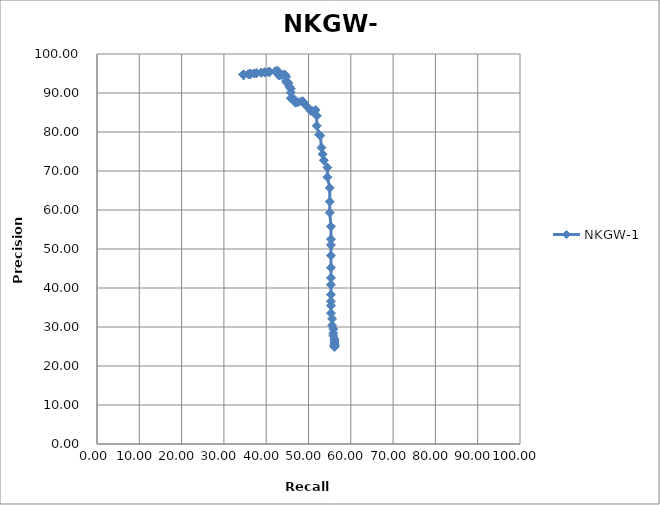
| Category | NKGW-1 |
|---|---|
| 34.637 | 94.656 |
| 34.637 | 94.656 |
| 34.637 | 94.656 |
| 34.637 | 94.656 |
| 34.637 | 94.656 |
| 34.637 | 94.656 |
| 34.637 | 94.656 |
| 34.637 | 94.656 |
| 34.637 | 94.656 |
| 34.637 | 94.656 |
| 34.637 | 94.656 |
| 34.637 | 94.656 |
| 34.637 | 94.656 |
| 35.754 | 94.815 |
| 36.034 | 94.853 |
| 36.313 | 94.891 |
| 36.313 | 94.891 |
| 36.313 | 94.891 |
| 37.151 | 95 |
| 37.151 | 95 |
| 37.151 | 95 |
| 37.709 | 95.07 |
| 37.709 | 95.07 |
| 38.827 | 95.205 |
| 38.827 | 95.205 |
| 39.665 | 95.302 |
| 39.665 | 95.302 |
| 39.665 | 95.302 |
| 40.503 | 95.395 |
| 40.782 | 95.425 |
| 40.782 | 95.425 |
| 40.782 | 95.425 |
| 42.179 | 95.57 |
| 42.458 | 95.597 |
| 42.737 | 95.625 |
| 42.737 | 95.625 |
| 42.737 | 95.031 |
| 42.737 | 95.031 |
| 42.737 | 95.031 |
| 42.737 | 95.031 |
| 43.017 | 94.479 |
| 43.575 | 94.545 |
| 44.134 | 94.611 |
| 44.134 | 94.611 |
| 44.413 | 94.643 |
| 44.413 | 94.643 |
| 44.693 | 94.118 |
| 44.693 | 93.023 |
| 44.972 | 92.529 |
| 45.251 | 92.571 |
| 45.531 | 91.573 |
| 45.81 | 91.111 |
| 45.81 | 90.11 |
| 45.81 | 88.649 |
| 46.648 | 88.36 |
| 46.927 | 87.5 |
| 47.486 | 87.629 |
| 48.324 | 87.817 |
| 48.603 | 87.879 |
| 48.883 | 87.5 |
| 49.721 | 86.408 |
| 50.559 | 85.377 |
| 50.838 | 85.446 |
| 51.676 | 85.648 |
| 51.955 | 84.163 |
| 51.955 | 81.579 |
| 52.514 | 79.325 |
| 52.793 | 79.079 |
| 53.073 | 76 |
| 53.352 | 74.319 |
| 53.631 | 72.727 |
| 54.469 | 70.909 |
| 54.469 | 68.421 |
| 55.028 | 65.667 |
| 55.028 | 62.145 |
| 55.028 | 59.337 |
| 55.307 | 55.775 |
| 55.307 | 52.52 |
| 55.307 | 51.031 |
| 55.307 | 48.293 |
| 55.307 | 45.205 |
| 55.307 | 42.581 |
| 55.307 | 40.825 |
| 55.307 | 38.298 |
| 55.307 | 36.599 |
| 55.307 | 35.484 |
| 55.307 | 33.559 |
| 55.587 | 32.097 |
| 55.587 | 30.428 |
| 55.866 | 29.499 |
| 55.866 | 28.409 |
| 55.866 | 27.739 |
| 56.145 | 26.908 |
| 56.145 | 26.378 |
| 56.145 | 25.902 |
| 56.145 | 25.573 |
| 56.145 | 25.315 |
| 56.145 | 25.188 |
| 56.145 | 24.938 |
| 56.145 | 24.876 |